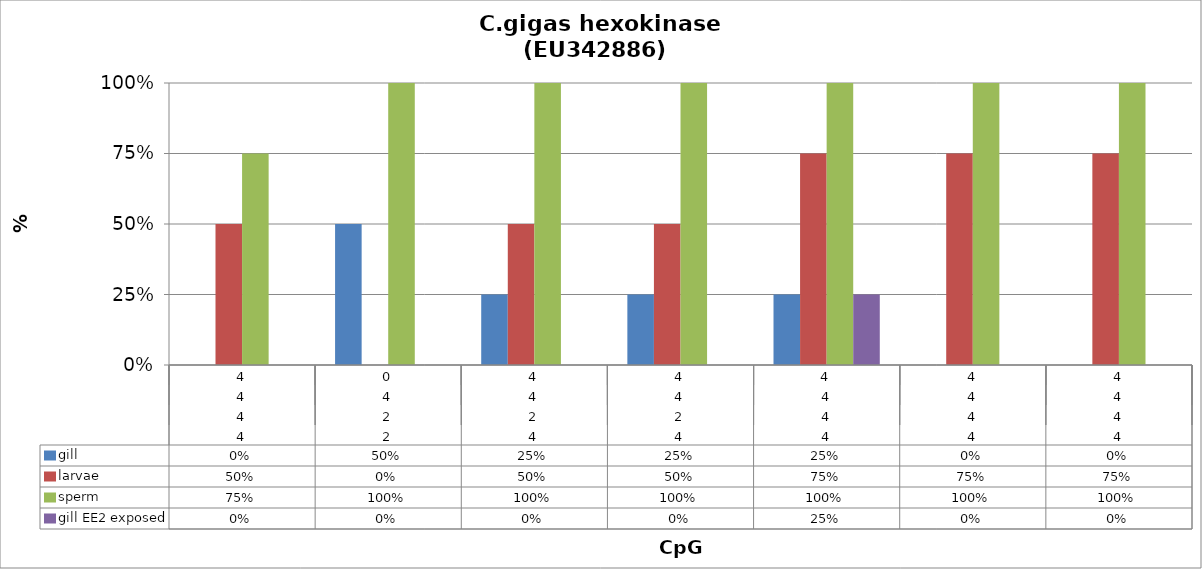
| Category | gill | larvae | sperm | gill EE2 exposed |
|---|---|---|---|---|
| 0 | 0 | 0.5 | 0.75 | 0 |
| 1 | 0.5 | 0 | 1 | 0 |
| 2 | 0.25 | 0.5 | 1 | 0 |
| 3 | 0.25 | 0.5 | 1 | 0 |
| 4 | 0.25 | 0.75 | 1 | 0.25 |
| 5 | 0 | 0.75 | 1 | 0 |
| 6 | 0 | 0.75 | 1 | 0 |